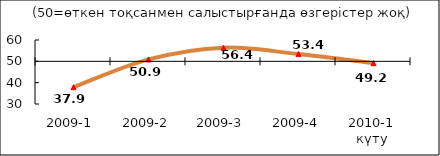
| Category | Диф.индекс ↓ |
|---|---|
| 2009-1 | 37.865 |
| 2009-2 | 50.89 |
| 2009-3 | 56.415 |
| 2009-4 | 53.385 |
| 2010-1 күту | 49.15 |